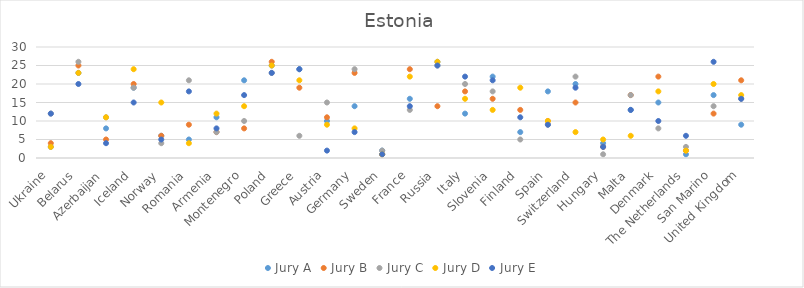
| Category | Jury A | Jury B | Jury C | Jury D | Jury E |
|---|---|---|---|---|---|
| Ukraine | 3 | 4 | 12 | 3 | 12 |
| Belarus | 23 | 25 | 26 | 23 | 20 |
| Azerbaijan | 8 | 5 | 11 | 11 | 4 |
| Iceland | 19 | 20 | 19 | 24 | 15 |
| Norway | 6 | 6 | 4 | 15 | 5 |
| Romania | 5 | 9 | 21 | 4 | 18 |
| Armenia | 11 | 7 | 7 | 12 | 8 |
| Montenegro | 21 | 8 | 10 | 14 | 17 |
| Poland | 25 | 26 | 23 | 25 | 23 |
| Greece | 24 | 19 | 6 | 21 | 24 |
| Austria | 10 | 11 | 15 | 9 | 2 |
| Germany | 14 | 23 | 24 | 8 | 7 |
| Sweden | 2 | 1 | 2 | 1 | 1 |
| France | 16 | 24 | 13 | 22 | 14 |
| Russia | 26 | 14 | 25 | 26 | 25 |
| Italy | 12 | 18 | 20 | 16 | 22 |
| Slovenia | 22 | 16 | 18 | 13 | 21 |
| Finland | 7 | 13 | 5 | 19 | 11 |
| Spain | 18 | 10 | 9 | 10 | 9 |
| Switzerland | 20 | 15 | 22 | 7 | 19 |
| Hungary | 4 | 3 | 1 | 5 | 3 |
| Malta | 13 | 17 | 17 | 6 | 13 |
| Denmark | 15 | 22 | 8 | 18 | 10 |
| The Netherlands | 1 | 2 | 3 | 2 | 6 |
| San Marino | 17 | 12 | 14 | 20 | 26 |
| United Kingdom | 9 | 21 | 16 | 17 | 16 |